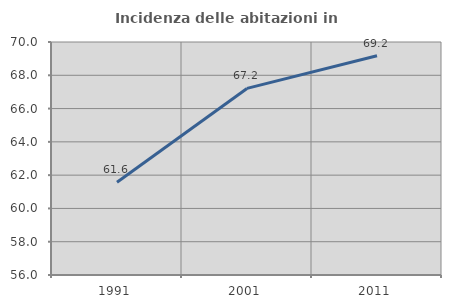
| Category | Incidenza delle abitazioni in proprietà  |
|---|---|
| 1991.0 | 61.568 |
| 2001.0 | 67.211 |
| 2011.0 | 69.174 |